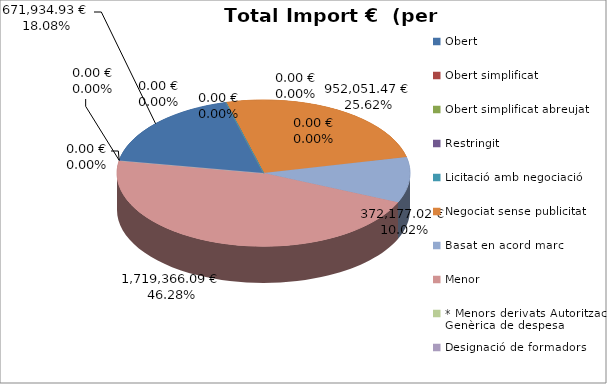
| Category | Total preu              (amb iva) |
|---|---|
| Obert | 671934.93 |
| Obert simplificat | 0 |
| Obert simplificat abreujat | 0 |
| Restringit | 0 |
| Licitació amb negociació | 0 |
| Negociat sense publicitat | 952051.47 |
| Basat en acord marc | 372177.02 |
| Menor | 1719366.093 |
| * Menors derivats Autorització Genèrica de despesa | 0 |
| Designació de formadors | 0 |